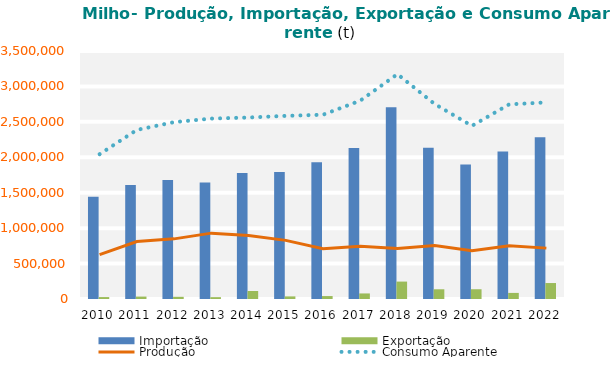
| Category | Importação | Exportação |
|---|---|---|
| 2010.0 | 1444615.648 | 27190.11 |
| 2011.0 | 1610127.503 | 34102.379 |
| 2012.0 | 1678209.957 | 30721.863 |
| 2013.0 | 1642772.093 | 26168.108 |
| 2014.0 | 1777065.78 | 112724.945 |
| 2015.0 | 1793806.653 | 36737.867 |
| 2016.0 | 1931473.634 | 41405.229 |
| 2017.0 | 2132302.904 | 78458.824 |
| 2018.0 | 2705449.975 | 245861.143 |
| 2019.0 | 2133585.446 | 137308.943 |
| 2020.0 | 1899505.666 | 137712.452 |
| 2021.0 | 2080273.672 | 85936.264 |
| 2022.0 | 2281948.598 | 225350.826 |